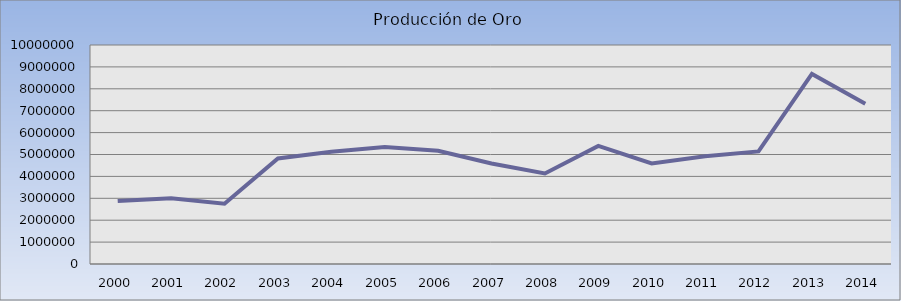
| Category | Series 0 |
|---|---|
| 2000.0 | 2871366.97 |
| 2001.0 | 3004980.5 |
| 2002.0 | 2749826.5 |
| 2003.0 | 4818615.82 |
| 2004.0 | 5128159.92 |
| 2005.0 | 5337675.07 |
| 2006.0 | 5168200.35 |
| 2007.0 | 4587711.58 |
| 2008.0 | 4132894.48 |
| 2009.0 | 5392188.2 |
| 2010.0 | 4592762.54 |
| 2011.0 | 4923325.95 |
| 2012.0 | 5138939.32 |
| 2013.0 | 8676419.7 |
| 2014.0 | 7322108.252 |